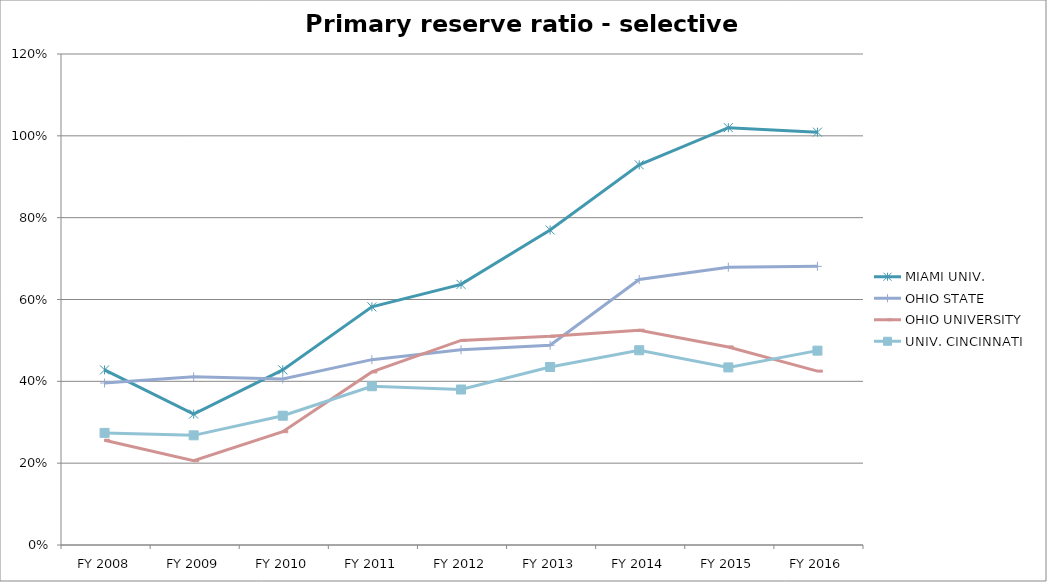
| Category | MIAMI UNIV.  | OHIO STATE  | OHIO UNIVERSITY  | UNIV. CINCINNATI  |
|---|---|---|---|---|
| FY 2016 | 1.009 | 0.681 | 0.425 | 0.475 |
| FY 2015 | 1.02 | 0.679 | 0.484 | 0.434 |
| FY 2014 | 0.929 | 0.649 | 0.525 | 0.476 |
| FY 2013 | 0.77 | 0.488 | 0.51 | 0.435 |
| FY 2012 | 0.637 | 0.477 | 0.5 | 0.38 |
| FY 2011 | 0.582 | 0.453 | 0.423 | 0.388 |
| FY 2010 | 0.428 | 0.406 | 0.277 | 0.316 |
| FY 2009 | 0.32 | 0.411 | 0.206 | 0.268 |
| FY 2008 | 0.428 | 0.396 | 0.256 | 0.274 |